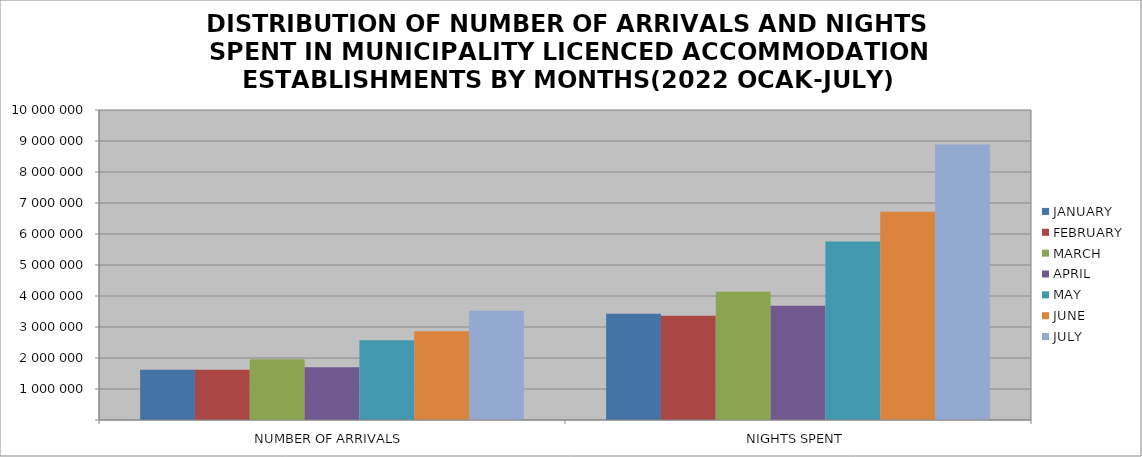
| Category | JANUARY | FEBRUARY | MARCH | APRIL | MAY | JUNE | JULY |
|---|---|---|---|---|---|---|---|
| NUMBER OF ARRIVALS | 1617436 | 1619305 | 1960867 | 1699422 | 2574819 | 2859746 | 3526528 |
| NIGHTS SPENT | 3427709 | 3362025 | 4136510 | 3684991 | 5758959 | 6716122 | 8890725 |